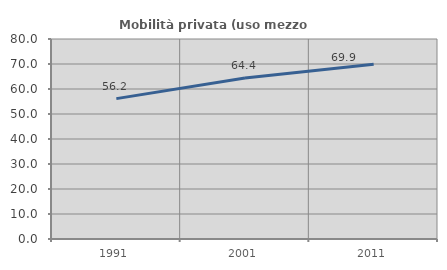
| Category | Mobilità privata (uso mezzo privato) |
|---|---|
| 1991.0 | 56.157 |
| 2001.0 | 64.37 |
| 2011.0 | 69.921 |